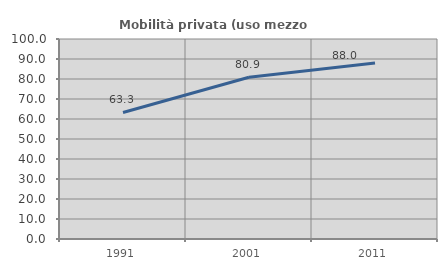
| Category | Mobilità privata (uso mezzo privato) |
|---|---|
| 1991.0 | 63.28 |
| 2001.0 | 80.851 |
| 2011.0 | 88.036 |